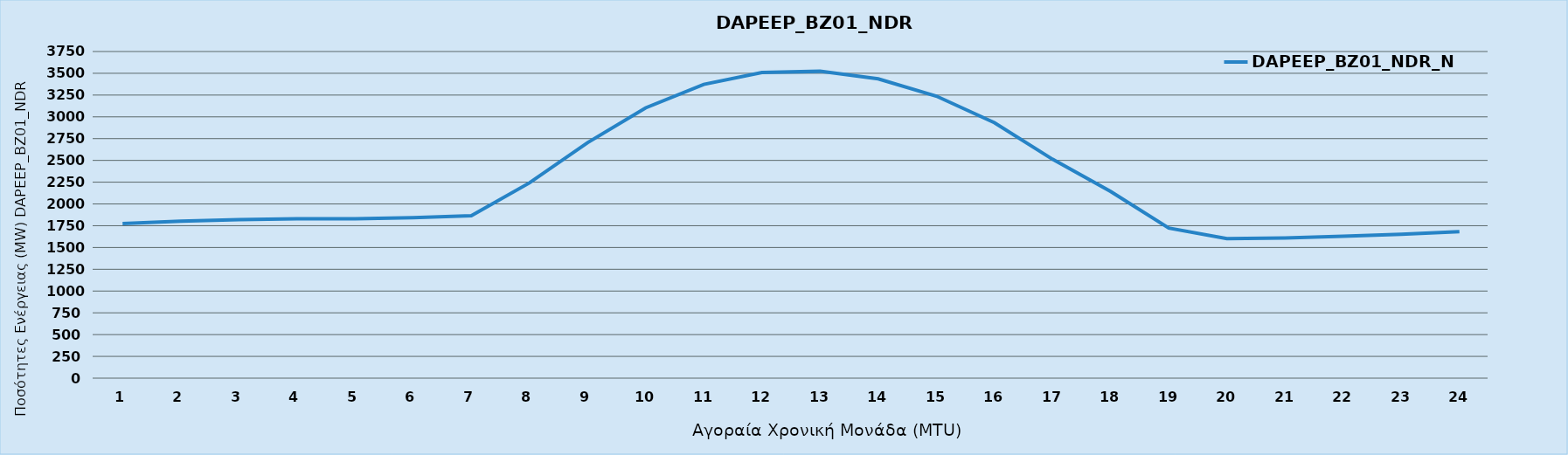
| Category | DAPEEP_BZ01_NDR_N1 |
|---|---|
| 0 | 1775 |
| 1 | 1802 |
| 2 | 1821 |
| 3 | 1829 |
| 4 | 1831 |
| 5 | 1842 |
| 6 | 1864 |
| 7 | 2242 |
| 8 | 2704 |
| 9 | 3103 |
| 10 | 3373 |
| 11 | 3510 |
| 12 | 3523 |
| 13 | 3436 |
| 14 | 3238 |
| 15 | 2933 |
| 16 | 2513 |
| 17 | 2143 |
| 18 | 1723 |
| 19 | 1602 |
| 20 | 1609 |
| 21 | 1629 |
| 22 | 1652 |
| 23 | 1681 |